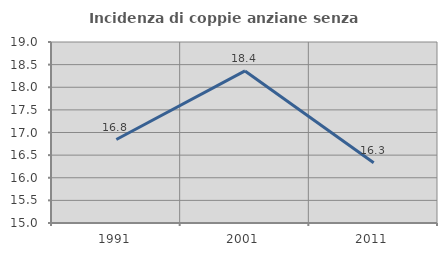
| Category | Incidenza di coppie anziane senza figli  |
|---|---|
| 1991.0 | 16.845 |
| 2001.0 | 18.36 |
| 2011.0 | 16.332 |